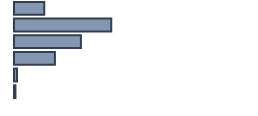
| Category | Percentatge |
|---|---|
| 0 | 12.652 |
| 1 | 40.53 |
| 2 | 27.879 |
| 3 | 17.045 |
| 4 | 1.288 |
| 5 | 0.606 |